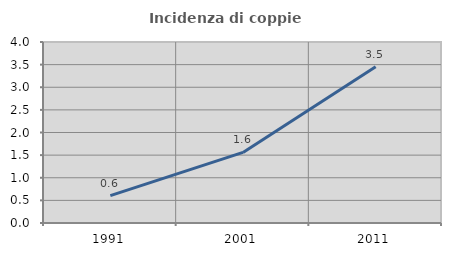
| Category | Incidenza di coppie miste |
|---|---|
| 1991.0 | 0.606 |
| 2001.0 | 1.56 |
| 2011.0 | 3.455 |